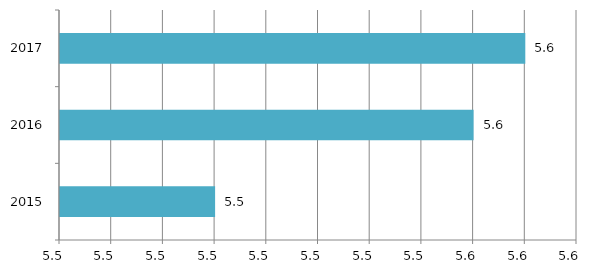
| Category | Series 0 |
|---|---|
| 2015.0 | 5.5 |
| 2016.0 | 5.55 |
| 2017.0 | 5.56 |